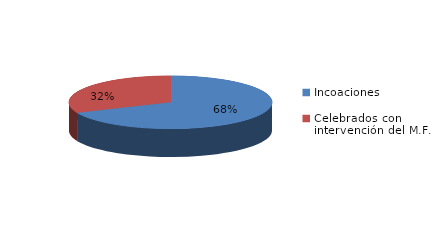
| Category | Series 0 |
|---|---|
| Incoaciones | 3279 |
| Celebrados con intervención del M.F. | 1513 |